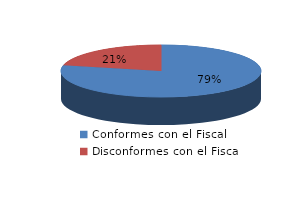
| Category | Series 0 |
|---|---|
| 0 | 1011 |
| 1 | 275 |